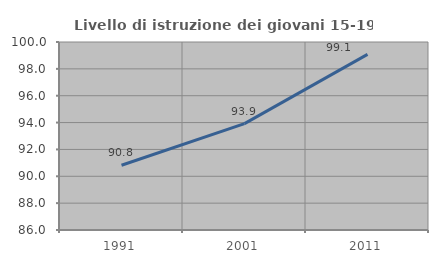
| Category | Livello di istruzione dei giovani 15-19 anni |
|---|---|
| 1991.0 | 90.821 |
| 2001.0 | 93.919 |
| 2011.0 | 99.083 |